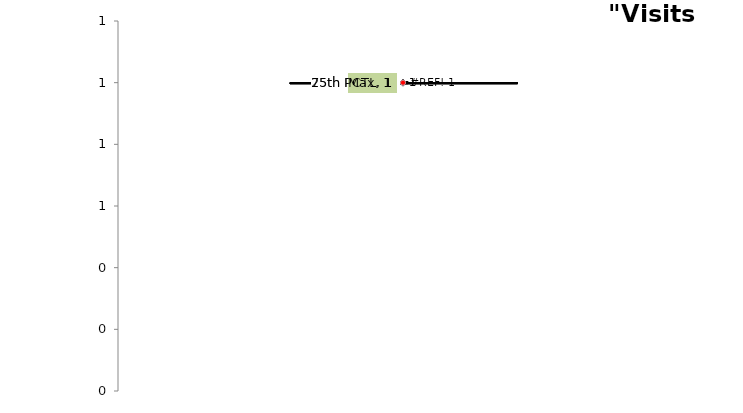
| Category | 25th PCTL | Min | µ | Max | 75th PCTL |
|---|---|---|---|---|---|
| 0 | 1 | 1 | 1 | 1 | 1 |